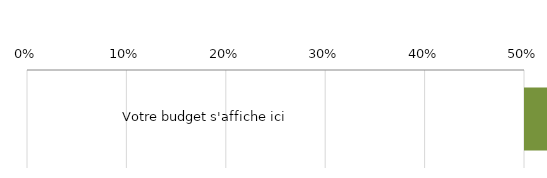
| Category | Series 0 | Series 1 |
|---|---|---|
| Votre budget s'affiche ici | 0.995 | 0.008 |